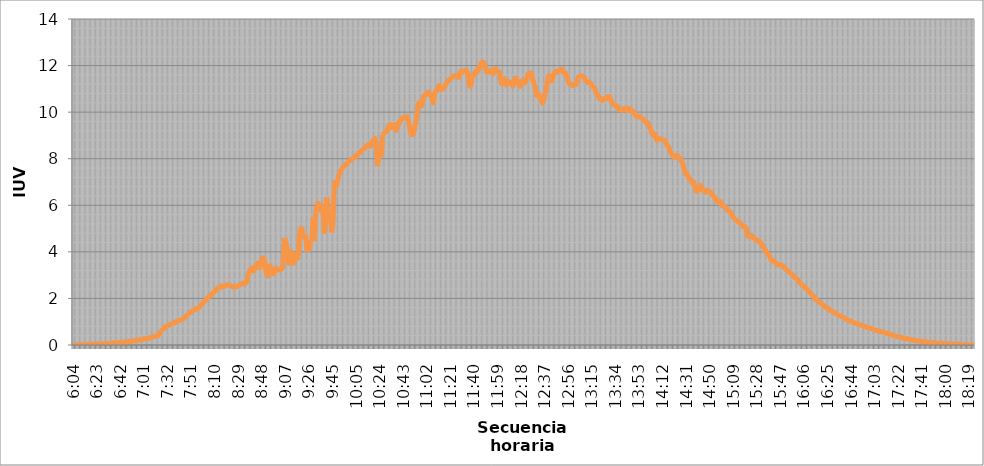
| Category | Series 0 |
|---|---|
| 0.25277777777777777 | 0.014 |
| 0.2534722222222222 | 0.014 |
| 0.25416666666666665 | 0.014 |
| 0.2548611111111111 | 0.014 |
| 0.2555555555555556 | 0.014 |
| 0.25625000000000003 | 0.014 |
| 0.2569444444444445 | 0.014 |
| 0.2576388888888889 | 0.014 |
| 0.25833333333333336 | 0.014 |
| 0.2590277777777778 | 0.014 |
| 0.25972222222222224 | 0.014 |
| 0.2604166666666667 | 0.014 |
| 0.2611111111111111 | 0.028 |
| 0.26180555555555557 | 0.028 |
| 0.2625 | 0.028 |
| 0.26319444444444445 | 0.028 |
| 0.2638888888888889 | 0.028 |
| 0.26458333333333334 | 0.028 |
| 0.2652777777777778 | 0.028 |
| 0.2659722222222222 | 0.028 |
| 0.26666666666666666 | 0.042 |
| 0.2673611111111111 | 0.042 |
| 0.26805555555555555 | 0.042 |
| 0.26875 | 0.042 |
| 0.26944444444444443 | 0.042 |
| 0.2701388888888889 | 0.056 |
| 0.2708333333333333 | 0.056 |
| 0.27152777777777776 | 0.056 |
| 0.2722222222222222 | 0.056 |
| 0.27291666666666664 | 0.07 |
| 0.2736111111111111 | 0.07 |
| 0.2743055555555555 | 0.07 |
| 0.27499999999999997 | 0.084 |
| 0.27569444444444446 | 0.084 |
| 0.27638888888888885 | 0.084 |
| 0.27708333333333335 | 0.084 |
| 0.2777777777777778 | 0.098 |
| 0.27847222222222223 | 0.098 |
| 0.2791666666666667 | 0.112 |
| 0.2798611111111111 | 0.112 |
| 0.28055555555555556 | 0.112 |
| 0.28125 | 0.126 |
| 0.28194444444444444 | 0.126 |
| 0.2826388888888889 | 0.14 |
| 0.2833333333333333 | 0.14 |
| 0.28402777777777777 | 0.154 |
| 0.2847222222222222 | 0.154 |
| 0.28541666666666665 | 0.168 |
| 0.28611111111111115 | 0.168 |
| 0.28680555555555554 | 0.182 |
| 0.28750000000000003 | 0.182 |
| 0.2881944444444445 | 0.196 |
| 0.2888888888888889 | 0.21 |
| 0.28958333333333336 | 0.224 |
| 0.2902777777777778 | 0.224 |
| 0.29097222222222224 | 0.238 |
| 0.2916666666666667 | 0.252 |
| 0.2923611111111111 | 0.266 |
| 0.29305555555555557 | 0.266 |
| 0.29375 | 0.28 |
| 0.29444444444444445 | 0.294 |
| 0.2951388888888889 | 0.308 |
| 0.29583333333333334 | 0.322 |
| 0.2965277777777778 | 0.336 |
| 0.2972222222222222 | 0.35 |
| 0.29791666666666666 | 0.363 |
| 0.2986111111111111 | 0.377 |
| 0.29930555555555555 | 0.391 |
| 0.3 | 0.405 |
| 0.30277777777777776 | 0.461 |
| 0.3055555555555555 | 0.545 |
| 0.30833333333333335 | 0.629 |
| 0.30972222222222223 | 0.671 |
| 0.3111111111111111 | 0.727 |
| 0.3125 | 0.783 |
| 0.31319444444444444 | 0.811 |
| 0.3138888888888889 | 0.839 |
| 0.3145833333333333 | 0.853 |
| 0.31527777777777777 | 0.881 |
| 0.3159722222222222 | 0.909 |
| 0.31666666666666665 | 0.937 |
| 0.31736111111111115 | 0.951 |
| 0.31805555555555554 | 0.979 |
| 0.31875000000000003 | 1.021 |
| 0.3194444444444445 | 1.035 |
| 0.3201388888888889 | 1.048 |
| 0.32083333333333336 | 1.062 |
| 0.3215277777777778 | 1.09 |
| 0.32222222222222224 | 1.118 |
| 0.3229166666666667 | 1.16 |
| 0.3236111111111111 | 1.202 |
| 0.32430555555555557 | 1.258 |
| 0.325 | 1.3 |
| 0.32569444444444445 | 1.356 |
| 0.3263888888888889 | 1.398 |
| 0.32708333333333334 | 1.44 |
| 0.3277777777777778 | 1.468 |
| 0.3284722222222222 | 1.496 |
| 0.32916666666666666 | 1.524 |
| 0.3298611111111111 | 1.566 |
| 0.33055555555555555 | 1.58 |
| 0.33125 | 1.608 |
| 0.33194444444444443 | 1.664 |
| 0.3326388888888889 | 1.734 |
| 0.3333333333333333 | 1.803 |
| 0.3340277777777778 | 1.859 |
| 0.3347222222222222 | 1.901 |
| 0.3354166666666667 | 1.957 |
| 0.3361111111111111 | 2.013 |
| 0.3368055555555556 | 2.069 |
| 0.33749999999999997 | 2.111 |
| 0.33819444444444446 | 2.153 |
| 0.33888888888888885 | 2.209 |
| 0.33958333333333335 | 2.265 |
| 0.34027777777777773 | 2.321 |
| 0.34097222222222223 | 2.377 |
| 0.3416666666666666 | 2.446 |
| 0.3423611111111111 | 2.46 |
| 0.3430555555555555 | 2.488 |
| 0.34375 | 2.53 |
| 0.3444444444444445 | 2.488 |
| 0.3451388888888889 | 2.516 |
| 0.3458333333333334 | 2.558 |
| 0.34652777777777777 | 2.572 |
| 0.34722222222222227 | 2.572 |
| 0.34791666666666665 | 2.586 |
| 0.34861111111111115 | 2.558 |
| 0.34930555555555554 | 2.53 |
| 0.35000000000000003 | 2.502 |
| 0.3506944444444444 | 2.488 |
| 0.3513888888888889 | 2.488 |
| 0.3520833333333333 | 2.502 |
| 0.3527777777777778 | 2.53 |
| 0.3534722222222222 | 2.544 |
| 0.3541666666666667 | 2.6 |
| 0.3548611111111111 | 2.614 |
| 0.35555555555555557 | 2.628 |
| 0.35625 | 2.67 |
| 0.35694444444444445 | 2.642 |
| 0.3576388888888889 | 2.684 |
| 0.35833333333333334 | 2.796 |
| 0.3590277777777778 | 3.076 |
| 0.3597222222222222 | 3.201 |
| 0.36041666666666666 | 3.271 |
| 0.3611111111111111 | 3.299 |
| 0.36180555555555555 | 3.173 |
| 0.3625 | 3.299 |
| 0.36319444444444443 | 3.397 |
| 0.3638888888888889 | 3.509 |
| 0.3645833333333333 | 3.425 |
| 0.3652777777777778 | 3.313 |
| 0.3659722222222222 | 3.579 |
| 0.3666666666666667 | 3.733 |
| 0.3673611111111111 | 3.705 |
| 0.3680555555555556 | 3.607 |
| 0.36874999999999997 | 3.159 |
| 0.36944444444444446 | 3.02 |
| 0.37013888888888885 | 3.006 |
| 0.37083333333333335 | 3.481 |
| 0.37152777777777773 | 3.285 |
| 0.37222222222222223 | 3.09 |
| 0.3729166666666666 | 3.048 |
| 0.3736111111111111 | 3.118 |
| 0.3743055555555555 | 3.299 |
| 0.375 | 3.257 |
| 0.3756944444444445 | 3.229 |
| 0.3763888888888889 | 3.215 |
| 0.3770833333333334 | 3.243 |
| 0.37777777777777777 | 3.299 |
| 0.37847222222222227 | 3.551 |
| 0.37916666666666665 | 4.599 |
| 0.37986111111111115 | 4.488 |
| 0.38055555555555554 | 4.096 |
| 0.38125000000000003 | 3.635 |
| 0.3819444444444444 | 3.523 |
| 0.3826388888888889 | 3.998 |
| 0.3833333333333333 | 3.9 |
| 0.3840277777777778 | 3.523 |
| 0.3847222222222222 | 3.649 |
| 0.3854166666666667 | 3.886 |
| 0.3861111111111111 | 3.719 |
| 0.38680555555555557 | 3.817 |
| 0.3875 | 4.837 |
| 0.38819444444444445 | 4.949 |
| 0.3888888888888889 | 5.089 |
| 0.38958333333333334 | 4.544 |
| 0.3902777777777778 | 4.683 |
| 0.3909722222222222 | 4.781 |
| 0.39166666666666666 | 4.012 |
| 0.3923611111111111 | 4.306 |
| 0.39305555555555555 | 4.124 |
| 0.39375 | 4.39 |
| 0.39444444444444443 | 4.432 |
| 0.3951388888888889 | 5.466 |
| 0.3958333333333333 | 4.474 |
| 0.3965277777777778 | 5.662 |
| 0.3972222222222222 | 5.969 |
| 0.3979166666666667 | 6.081 |
| 0.3986111111111111 | 5.858 |
| 0.3993055555555556 | 6.109 |
| 0.39999999999999997 | 5.69 |
| 0.40069444444444446 | 5.886 |
| 0.40138888888888885 | 4.781 |
| 0.40208333333333335 | 5.326 |
| 0.40277777777777773 | 6.347 |
| 0.40347222222222223 | 5.983 |
| 0.4041666666666666 | 5.284 |
| 0.4048611111111111 | 5.55 |
| 0.4055555555555555 | 4.837 |
| 0.40625 | 5.159 |
| 0.4069444444444445 | 6.822 |
| 0.4076388888888889 | 7.06 |
| 0.4083333333333334 | 6.864 |
| 0.40902777777777777 | 7.13 |
| 0.40972222222222227 | 7.34 |
| 0.41041666666666665 | 7.479 |
| 0.41111111111111115 | 7.507 |
| 0.41180555555555554 | 7.633 |
| 0.41250000000000003 | 7.703 |
| 0.4131944444444444 | 7.745 |
| 0.4138888888888889 | 7.759 |
| 0.4145833333333333 | 7.829 |
| 0.4152777777777778 | 7.899 |
| 0.4159722222222222 | 7.927 |
| 0.4173611111111111 | 7.983 |
| 0.41805555555555557 | 8.011 |
| 0.41875 | 8.052 |
| 0.41944444444444445 | 8.122 |
| 0.4201388888888889 | 8.094 |
| 0.42083333333333334 | 8.178 |
| 0.4215277777777778 | 8.248 |
| 0.4222222222222222 | 8.276 |
| 0.42291666666666666 | 8.332 |
| 0.4236111111111111 | 8.374 |
| 0.42430555555555555 | 8.43 |
| 0.425 | 8.486 |
| 0.42569444444444443 | 8.528 |
| 0.4263888888888889 | 8.584 |
| 0.4270833333333333 | 8.612 |
| 0.4277777777777778 | 8.528 |
| 0.4284722222222222 | 8.654 |
| 0.4291666666666667 | 8.765 |
| 0.4298611111111111 | 8.793 |
| 0.4305555555555556 | 8.863 |
| 0.43124999999999997 | 8.626 |
| 0.43194444444444446 | 7.675 |
| 0.43263888888888885 | 8.08 |
| 0.43333333333333335 | 8.598 |
| 0.43402777777777773 | 8.08 |
| 0.43472222222222223 | 9.017 |
| 0.4354166666666666 | 9.073 |
| 0.4361111111111111 | 9.143 |
| 0.4368055555555555 | 9.199 |
| 0.4375 | 9.213 |
| 0.4381944444444445 | 9.423 |
| 0.4388888888888889 | 9.464 |
| 0.4395833333333334 | 9.436 |
| 0.44027777777777777 | 9.325 |
| 0.44097222222222227 | 9.436 |
| 0.44166666666666665 | 9.436 |
| 0.44236111111111115 | 9.213 |
| 0.44305555555555554 | 9.492 |
| 0.44375000000000003 | 9.478 |
| 0.4444444444444444 | 9.618 |
| 0.4451388888888889 | 9.688 |
| 0.4458333333333333 | 9.758 |
| 0.4465277777777778 | 9.758 |
| 0.4472222222222222 | 9.786 |
| 0.4479166666666667 | 9.786 |
| 0.4486111111111111 | 9.786 |
| 0.44930555555555557 | 9.548 |
| 0.45 | 9.269 |
| 0.45069444444444445 | 9.059 |
| 0.4513888888888889 | 9.045 |
| 0.45208333333333334 | 9.073 |
| 0.4527777777777778 | 9.381 |
| 0.4534722222222222 | 9.59 |
| 0.45416666666666666 | 10.052 |
| 0.4548611111111111 | 10.373 |
| 0.45555555555555555 | 10.387 |
| 0.45625 | 10.261 |
| 0.45694444444444443 | 10.359 |
| 0.4576388888888889 | 10.667 |
| 0.4583333333333333 | 10.723 |
| 0.4590277777777778 | 10.751 |
| 0.4597222222222222 | 10.834 |
| 0.4604166666666667 | 10.862 |
| 0.4611111111111111 | 10.779 |
| 0.4618055555555556 | 10.681 |
| 0.46249999999999997 | 10.555 |
| 0.46319444444444446 | 10.401 |
| 0.46388888888888885 | 10.779 |
| 0.46458333333333335 | 10.918 |
| 0.46527777777777773 | 10.932 |
| 0.46597222222222223 | 11.114 |
| 0.4666666666666666 | 11.128 |
| 0.4673611111111111 | 10.988 |
| 0.4680555555555555 | 10.988 |
| 0.46875 | 11.03 |
| 0.4694444444444445 | 11.086 |
| 0.4701388888888889 | 11.198 |
| 0.4708333333333334 | 11.296 |
| 0.47152777777777777 | 11.366 |
| 0.47222222222222227 | 11.394 |
| 0.47291666666666665 | 11.436 |
| 0.47361111111111115 | 11.52 |
| 0.47430555555555554 | 11.547 |
| 0.47500000000000003 | 11.547 |
| 0.4756944444444444 | 11.547 |
| 0.4763888888888889 | 11.534 |
| 0.4770833333333333 | 11.492 |
| 0.4777777777777778 | 11.589 |
| 0.4784722222222222 | 11.757 |
| 0.4791666666666667 | 11.715 |
| 0.4798611111111111 | 11.757 |
| 0.48055555555555557 | 11.785 |
| 0.48125 | 11.799 |
| 0.48194444444444445 | 11.757 |
| 0.4826388888888889 | 11.506 |
| 0.48333333333333334 | 11.17 |
| 0.4840277777777778 | 11.128 |
| 0.4847222222222222 | 11.436 |
| 0.48541666666666666 | 11.617 |
| 0.4861111111111111 | 11.617 |
| 0.48680555555555555 | 11.757 |
| 0.4875 | 11.701 |
| 0.48819444444444443 | 11.869 |
| 0.4888888888888889 | 11.883 |
| 0.4895833333333333 | 12.051 |
| 0.4902777777777778 | 12.149 |
| 0.4909722222222222 | 12.149 |
| 0.4916666666666667 | 12.065 |
| 0.4923611111111111 | 11.897 |
| 0.4930555555555556 | 11.715 |
| 0.49374999999999997 | 11.729 |
| 0.49444444444444446 | 11.743 |
| 0.49513888888888885 | 11.799 |
| 0.49583333333333335 | 11.771 |
| 0.49652777777777773 | 11.645 |
| 0.49722222222222223 | 11.813 |
| 0.4979166666666666 | 11.869 |
| 0.4986111111111111 | 11.799 |
| 0.4993055555555555 | 11.729 |
| 0.5 | 11.715 |
| 0.5006944444444444 | 11.492 |
| 0.5013888888888889 | 11.226 |
| 0.5020833333333333 | 11.268 |
| 0.5027777777777778 | 11.45 |
| 0.5034722222222222 | 11.226 |
| 0.5041666666666667 | 11.17 |
| 0.5048611111111111 | 11.324 |
| 0.5055555555555555 | 11.24 |
| 0.50625 | 11.296 |
| 0.5069444444444444 | 11.254 |
| 0.5076388888888889 | 11.128 |
| 0.5083333333333333 | 11.254 |
| 0.5090277777777777 | 11.464 |
| 0.5097222222222222 | 11.422 |
| 0.5104166666666666 | 11.24 |
| 0.5111111111111112 | 11.254 |
| 0.5118055555555555 | 11.114 |
| 0.5125000000000001 | 11.324 |
| 0.5131944444444444 | 11.352 |
| 0.513888888888889 | 11.254 |
| 0.5145833333333333 | 11.282 |
| 0.5152777777777778 | 11.366 |
| 0.5159722222222222 | 11.603 |
| 0.5166666666666667 | 11.659 |
| 0.517361111111111 | 11.701 |
| 0.5180555555555556 | 11.617 |
| 0.5187499999999999 | 11.408 |
| 0.5194444444444445 | 11.226 |
| 0.5201388888888888 | 11.058 |
| 0.5208333333333334 | 10.737 |
| 0.5215277777777778 | 10.765 |
| 0.5222222222222223 | 10.751 |
| 0.5229166666666667 | 10.555 |
| 0.5236111111111111 | 10.555 |
| 0.5243055555555556 | 10.387 |
| 0.525 | 10.583 |
| 0.5256944444444445 | 10.821 |
| 0.5263888888888889 | 11.002 |
| 0.5270833333333333 | 11.296 |
| 0.5277777777777778 | 11.561 |
| 0.5284722222222222 | 11.492 |
| 0.5291666666666667 | 11.352 |
| 0.5298611111111111 | 11.408 |
| 0.5305555555555556 | 11.631 |
| 0.53125 | 11.729 |
| 0.5319444444444444 | 11.757 |
| 0.5326388888888889 | 11.701 |
| 0.5333333333333333 | 11.785 |
| 0.5340277777777778 | 11.771 |
| 0.5347222222222222 | 11.855 |
| 0.5354166666666667 | 11.785 |
| 0.5361111111111111 | 11.701 |
| 0.5368055555555555 | 11.701 |
| 0.5375 | 11.575 |
| 0.5381944444444444 | 11.506 |
| 0.5388888888888889 | 11.268 |
| 0.5395833333333333 | 11.212 |
| 0.5402777777777777 | 11.184 |
| 0.5409722222222222 | 11.156 |
| 0.5416666666666666 | 11.142 |
| 0.5423611111111112 | 11.226 |
| 0.5430555555555555 | 11.198 |
| 0.5437500000000001 | 11.352 |
| 0.5444444444444444 | 11.506 |
| 0.545138888888889 | 11.52 |
| 0.5458333333333333 | 11.561 |
| 0.5465277777777778 | 11.547 |
| 0.5472222222222222 | 11.534 |
| 0.5479166666666667 | 11.436 |
| 0.548611111111111 | 11.31 |
| 0.5493055555555556 | 11.268 |
| 0.5499999999999999 | 11.296 |
| 0.5506944444444445 | 11.282 |
| 0.5513888888888888 | 11.212 |
| 0.5520833333333334 | 11.114 |
| 0.5527777777777778 | 11.086 |
| 0.5534722222222223 | 11.044 |
| 0.5541666666666667 | 10.834 |
| 0.5548611111111111 | 10.751 |
| 0.5555555555555556 | 10.695 |
| 0.55625 | 10.569 |
| 0.5569444444444445 | 10.569 |
| 0.5576388888888889 | 10.499 |
| 0.5583333333333333 | 10.569 |
| 0.5590277777777778 | 10.569 |
| 0.5597222222222222 | 10.569 |
| 0.5604166666666667 | 10.639 |
| 0.5611111111111111 | 10.667 |
| 0.5618055555555556 | 10.653 |
| 0.5625 | 10.527 |
| 0.5631944444444444 | 10.387 |
| 0.5638888888888889 | 10.317 |
| 0.5645833333333333 | 10.317 |
| 0.5652777777777778 | 10.275 |
| 0.5659722222222222 | 10.261 |
| 0.5666666666666667 | 10.177 |
| 0.5673611111111111 | 10.108 |
| 0.5680555555555555 | 10.108 |
| 0.56875 | 10.08 |
| 0.5694444444444444 | 10.122 |
| 0.5701388888888889 | 10.163 |
| 0.5708333333333333 | 10.149 |
| 0.5715277777777777 | 10.052 |
| 0.5722222222222222 | 10.163 |
| 0.5729166666666666 | 10.108 |
| 0.5736111111111112 | 10.136 |
| 0.5743055555555555 | 10.024 |
| 0.5750000000000001 | 9.982 |
| 0.5756944444444444 | 9.996 |
| 0.576388888888889 | 9.884 |
| 0.5770833333333333 | 9.8 |
| 0.5777777777777778 | 9.8 |
| 0.5784722222222222 | 9.814 |
| 0.5791666666666667 | 9.786 |
| 0.579861111111111 | 9.73 |
| 0.5805555555555556 | 9.674 |
| 0.5812499999999999 | 9.632 |
| 0.5819444444444445 | 9.604 |
| 0.5826388888888888 | 9.52 |
| 0.5833333333333334 | 9.534 |
| 0.5840277777777778 | 9.381 |
| 0.5847222222222223 | 9.325 |
| 0.5854166666666667 | 9.087 |
| 0.5861111111111111 | 9.017 |
| 0.5868055555555556 | 9.073 |
| 0.5875 | 9.017 |
| 0.5881944444444445 | 8.793 |
| 0.5888888888888889 | 8.863 |
| 0.5895833333333333 | 8.863 |
| 0.5902777777777778 | 8.849 |
| 0.5909722222222222 | 8.821 |
| 0.5916666666666667 | 8.821 |
| 0.5923611111111111 | 8.793 |
| 0.5930555555555556 | 8.751 |
| 0.59375 | 8.612 |
| 0.5944444444444444 | 8.542 |
| 0.5951388888888889 | 8.444 |
| 0.5958333333333333 | 8.29 |
| 0.5965277777777778 | 8.22 |
| 0.5972222222222222 | 8.108 |
| 0.5979166666666667 | 8.066 |
| 0.5986111111111111 | 8.08 |
| 0.5993055555555555 | 8.15 |
| 0.6 | 8.122 |
| 0.6006944444444444 | 8.039 |
| 0.6013888888888889 | 7.997 |
| 0.6020833333333333 | 7.885 |
| 0.6027777777777777 | 7.773 |
| 0.6034722222222222 | 7.577 |
| 0.6041666666666666 | 7.367 |
| 0.6048611111111112 | 7.34 |
| 0.6055555555555555 | 7.284 |
| 0.6062500000000001 | 7.144 |
| 0.6069444444444444 | 7.13 |
| 0.607638888888889 | 7.06 |
| 0.6083333333333333 | 6.934 |
| 0.6090277777777778 | 6.99 |
| 0.6097222222222222 | 6.71 |
| 0.6104166666666667 | 6.613 |
| 0.611111111111111 | 6.613 |
| 0.6118055555555556 | 6.696 |
| 0.6124999999999999 | 6.85 |
| 0.6131944444444445 | 6.794 |
| 0.6138888888888888 | 6.696 |
| 0.6145833333333334 | 6.627 |
| 0.6152777777777778 | 6.557 |
| 0.6159722222222223 | 6.613 |
| 0.6166666666666667 | 6.654 |
| 0.6173611111111111 | 6.599 |
| 0.6180555555555556 | 6.571 |
| 0.61875 | 6.529 |
| 0.6194444444444445 | 6.431 |
| 0.6201388888888889 | 6.389 |
| 0.6208333333333333 | 6.305 |
| 0.6215277777777778 | 6.179 |
| 0.6222222222222222 | 6.193 |
| 0.6229166666666667 | 6.193 |
| 0.6236111111111111 | 6.165 |
| 0.6243055555555556 | 6.025 |
| 0.625 | 5.969 |
| 0.6256944444444444 | 5.969 |
| 0.6263888888888889 | 5.942 |
| 0.6270833333333333 | 5.872 |
| 0.6277777777777778 | 5.788 |
| 0.6284722222222222 | 5.746 |
| 0.6291666666666667 | 5.732 |
| 0.6298611111111111 | 5.662 |
| 0.6305555555555555 | 5.55 |
| 0.63125 | 5.466 |
| 0.6319444444444444 | 5.396 |
| 0.6326388888888889 | 5.354 |
| 0.6333333333333333 | 5.326 |
| 0.6340277777777777 | 5.312 |
| 0.6347222222222222 | 5.256 |
| 0.6354166666666666 | 5.173 |
| 0.6361111111111112 | 5.117 |
| 0.6368055555555555 | 5.075 |
| 0.6375000000000001 | 5.075 |
| 0.6381944444444444 | 4.991 |
| 0.638888888888889 | 4.753 |
| 0.6395833333333333 | 4.655 |
| 0.6402777777777778 | 4.683 |
| 0.6409722222222222 | 4.725 |
| 0.6416666666666667 | 4.641 |
| 0.642361111111111 | 4.613 |
| 0.6430555555555556 | 4.571 |
| 0.6437499999999999 | 4.488 |
| 0.6444444444444445 | 4.502 |
| 0.6451388888888888 | 4.488 |
| 0.6458333333333334 | 4.446 |
| 0.6465277777777778 | 4.362 |
| 0.6472222222222223 | 4.278 |
| 0.6479166666666667 | 4.208 |
| 0.6486111111111111 | 4.138 |
| 0.6493055555555556 | 4.012 |
| 0.65 | 3.914 |
| 0.6506944444444445 | 3.9 |
| 0.6513888888888889 | 3.817 |
| 0.6520833333333333 | 3.677 |
| 0.6527777777777778 | 3.635 |
| 0.6534722222222222 | 3.621 |
| 0.6541666666666667 | 3.565 |
| 0.6548611111111111 | 3.509 |
| 0.6555555555555556 | 3.467 |
| 0.65625 | 3.425 |
| 0.6569444444444444 | 3.467 |
| 0.6576388888888889 | 3.453 |
| 0.6583333333333333 | 3.397 |
| 0.6590277777777778 | 3.369 |
| 0.6597222222222222 | 3.327 |
| 0.6604166666666667 | 3.257 |
| 0.6611111111111111 | 3.201 |
| 0.6618055555555555 | 3.159 |
| 0.6625 | 3.118 |
| 0.6631944444444444 | 3.076 |
| 0.6638888888888889 | 3.034 |
| 0.6645833333333333 | 2.964 |
| 0.6652777777777777 | 2.908 |
| 0.6659722222222222 | 2.866 |
| 0.6666666666666666 | 2.838 |
| 0.6673611111111111 | 2.782 |
| 0.6680555555555556 | 2.698 |
| 0.6687500000000001 | 2.628 |
| 0.6694444444444444 | 2.586 |
| 0.6701388888888888 | 2.544 |
| 0.6708333333333334 | 2.502 |
| 0.6715277777777778 | 2.433 |
| 0.6722222222222222 | 2.405 |
| 0.6729166666666666 | 2.349 |
| 0.6736111111111112 | 2.279 |
| 0.6743055555555556 | 2.223 |
| 0.6749999999999999 | 2.167 |
| 0.6756944444444444 | 2.111 |
| 0.6763888888888889 | 2.027 |
| 0.6770833333333334 | 1.957 |
| 0.6777777777777777 | 1.929 |
| 0.6784722222222223 | 1.887 |
| 0.6791666666666667 | 1.859 |
| 0.6798611111111111 | 1.803 |
| 0.6805555555555555 | 1.761 |
| 0.68125 | 1.72 |
| 0.6819444444444445 | 1.65 |
| 0.6826388888888889 | 1.622 |
| 0.6833333333333332 | 1.608 |
| 0.6840277777777778 | 1.58 |
| 0.6847222222222222 | 1.538 |
| 0.6854166666666667 | 1.482 |
| 0.686111111111111 | 1.454 |
| 0.6868055555555556 | 1.426 |
| 0.6875 | 1.398 |
| 0.6881944444444444 | 1.37 |
| 0.688888888888889 | 1.328 |
| 0.6895833333333333 | 1.3 |
| 0.6902777777777778 | 1.272 |
| 0.6909722222222222 | 1.244 |
| 0.6916666666666668 | 1.216 |
| 0.6923611111111111 | 1.188 |
| 0.6930555555555555 | 1.16 |
| 0.69375 | 1.132 |
| 0.6944444444444445 | 1.104 |
| 0.6951388888888889 | 1.076 |
| 0.6958333333333333 | 1.048 |
| 0.6965277777777777 | 1.021 |
| 0.6972222222222223 | 1.007 |
| 0.6979166666666666 | 0.979 |
| 0.6986111111111111 | 0.951 |
| 0.6993055555555556 | 0.937 |
| 0.7000000000000001 | 0.923 |
| 0.7006944444444444 | 0.895 |
| 0.7013888888888888 | 0.881 |
| 0.7020833333333334 | 0.867 |
| 0.7027777777777778 | 0.853 |
| 0.7034722222222222 | 0.825 |
| 0.7041666666666666 | 0.811 |
| 0.7048611111111112 | 0.797 |
| 0.7055555555555556 | 0.769 |
| 0.7062499999999999 | 0.755 |
| 0.7069444444444444 | 0.741 |
| 0.7076388888888889 | 0.713 |
| 0.7083333333333334 | 0.699 |
| 0.7090277777777777 | 0.685 |
| 0.7097222222222223 | 0.657 |
| 0.7104166666666667 | 0.643 |
| 0.7111111111111111 | 0.629 |
| 0.7118055555555555 | 0.615 |
| 0.7125 | 0.601 |
| 0.7131944444444445 | 0.587 |
| 0.7138888888888889 | 0.573 |
| 0.7145833333333332 | 0.559 |
| 0.7152777777777778 | 0.531 |
| 0.7159722222222222 | 0.517 |
| 0.7166666666666667 | 0.503 |
| 0.717361111111111 | 0.489 |
| 0.7180555555555556 | 0.475 |
| 0.71875 | 0.461 |
| 0.7194444444444444 | 0.447 |
| 0.720138888888889 | 0.419 |
| 0.7208333333333333 | 0.405 |
| 0.7215277777777778 | 0.391 |
| 0.7222222222222222 | 0.377 |
| 0.7229166666666668 | 0.363 |
| 0.7236111111111111 | 0.35 |
| 0.7243055555555555 | 0.336 |
| 0.725 | 0.322 |
| 0.7256944444444445 | 0.308 |
| 0.7263888888888889 | 0.294 |
| 0.7270833333333333 | 0.294 |
| 0.7277777777777777 | 0.28 |
| 0.7284722222222223 | 0.266 |
| 0.7291666666666666 | 0.252 |
| 0.7298611111111111 | 0.238 |
| 0.7305555555555556 | 0.238 |
| 0.7312500000000001 | 0.224 |
| 0.7319444444444444 | 0.21 |
| 0.7326388888888888 | 0.196 |
| 0.7333333333333334 | 0.196 |
| 0.7340277777777778 | 0.182 |
| 0.7347222222222222 | 0.168 |
| 0.7354166666666666 | 0.168 |
| 0.7361111111111112 | 0.154 |
| 0.7368055555555556 | 0.154 |
| 0.7374999999999999 | 0.14 |
| 0.7381944444444444 | 0.14 |
| 0.7388888888888889 | 0.126 |
| 0.7395833333333334 | 0.126 |
| 0.7402777777777777 | 0.112 |
| 0.7409722222222223 | 0.112 |
| 0.7416666666666667 | 0.098 |
| 0.7423611111111111 | 0.098 |
| 0.7430555555555555 | 0.098 |
| 0.74375 | 0.084 |
| 0.7444444444444445 | 0.084 |
| 0.7451388888888889 | 0.084 |
| 0.7458333333333332 | 0.07 |
| 0.7465277777777778 | 0.07 |
| 0.7472222222222222 | 0.07 |
| 0.7479166666666667 | 0.07 |
| 0.748611111111111 | 0.056 |
| 0.7493055555555556 | 0.056 |
| 0.75 | 0.056 |
| 0.7506944444444444 | 0.042 |
| 0.751388888888889 | 0.042 |
| 0.7520833333333333 | 0.042 |
| 0.7527777777777778 | 0.042 |
| 0.7534722222222222 | 0.042 |
| 0.7541666666666668 | 0.028 |
| 0.7548611111111111 | 0.028 |
| 0.7555555555555555 | 0.028 |
| 0.75625 | 0.028 |
| 0.7569444444444445 | 0.028 |
| 0.7576388888888889 | 0.028 |
| 0.7583333333333333 | 0.028 |
| 0.7590277777777777 | 0.014 |
| 0.7597222222222223 | 0.014 |
| 0.7604166666666666 | 0.014 |
| 0.7611111111111111 | 0.014 |
| 0.7618055555555556 | 0.014 |
| 0.7625000000000001 | 0.014 |
| 0.7631944444444444 | 0.014 |
| 0.7638888888888888 | 0.014 |
| 0.7645833333333334 | 0.014 |
| 0.7652777777777778 | 0.014 |
| 0.7659722222222222 | 0.014 |